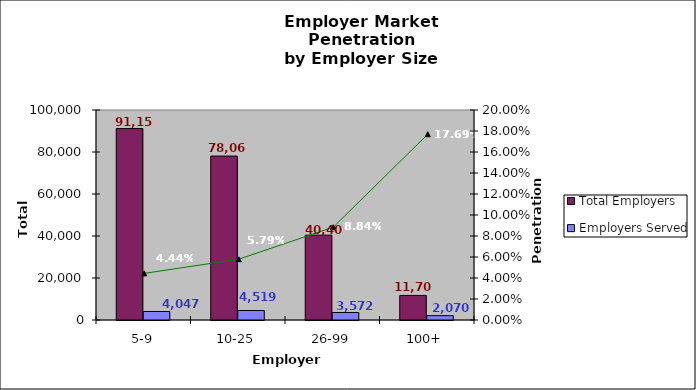
| Category | Total Employers | Employers Served |
|---|---|---|
| 5-9 | 91154 | 4047 |
| 10-25 | 78062 | 4519 |
| 26-99 | 40405 | 3572 |
| 100+ | 11701 | 2070 |